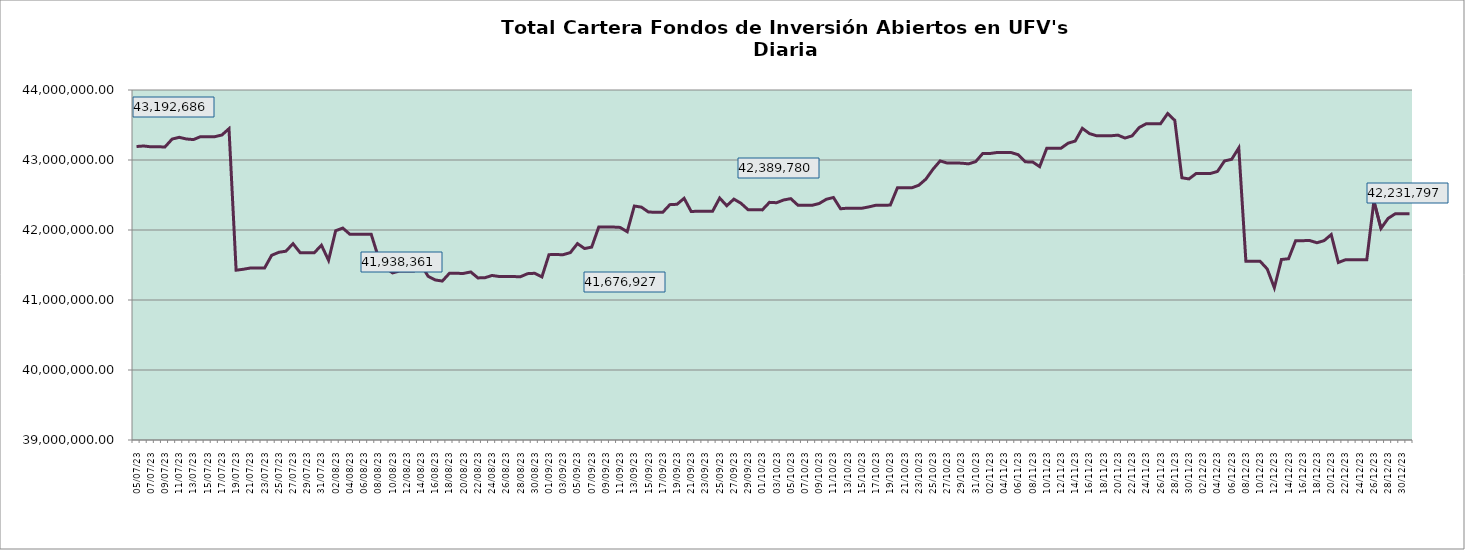
| Category | Cartera |
|---|---|
| 2023-07-05 | 43192686.34 |
| 2023-07-06 | 43200239.14 |
| 2023-07-07 | 43188626.88 |
| 2023-07-08 | 43187850.4 |
| 2023-07-09 | 43187104.54 |
| 2023-07-10 | 43298842.56 |
| 2023-07-11 | 43324023.73 |
| 2023-07-12 | 43300355.76 |
| 2023-07-13 | 43291538.65 |
| 2023-07-14 | 43333794.88 |
| 2023-07-15 | 43333475.93 |
| 2023-07-16 | 43333159.39 |
| 2023-07-17 | 43357047.45 |
| 2023-07-18 | 43447254.71 |
| 2023-07-19 | 41425630.36 |
| 2023-07-20 | 41438977.92 |
| 2023-07-21 | 41456769.13 |
| 2023-07-22 | 41456443.23 |
| 2023-07-23 | 41456161.03 |
| 2023-07-24 | 41638590.23 |
| 2023-07-25 | 41681225.4 |
| 2023-07-26 | 41697029.88 |
| 2023-07-27 | 41804683.04 |
| 2023-07-28 | 41676723.75 |
| 2023-07-29 | 41676408.14 |
| 2023-07-30 | 41676073.6 |
| 2023-07-31 | 41782568.47 |
| 2023-08-01 | 41567246.25 |
| 2023-08-02 | 41989389.58 |
| 2023-08-03 | 42027550.1 |
| 2023-08-04 | 41938597.62 |
| 2023-08-05 | 41938360.51 |
| 2023-08-06 | 41938153.1 |
| 2023-08-07 | 41937942.81 |
| 2023-08-08 | 41613622.08 |
| 2023-08-09 | 41463554.1 |
| 2023-08-10 | 41387337.54 |
| 2023-08-11 | 41414887.74 |
| 2023-08-12 | 41413764.61 |
| 2023-08-13 | 41413559.38 |
| 2023-08-14 | 41506858.89 |
| 2023-08-15 | 41338608.62 |
| 2023-08-16 | 41286301.63 |
| 2023-08-17 | 41270756.92 |
| 2023-08-18 | 41381603.16 |
| 2023-08-19 | 41380463.76 |
| 2023-08-20 | 41380147.98 |
| 2023-08-21 | 41400521 |
| 2023-08-22 | 41315409.32 |
| 2023-08-23 | 41318591.69 |
| 2023-08-24 | 41350548.96 |
| 2023-08-25 | 41335593.37 |
| 2023-08-26 | 41334963.42 |
| 2023-08-27 | 41334311.09 |
| 2023-08-28 | 41333141.15 |
| 2023-08-29 | 41376370.28 |
| 2023-08-30 | 41381821.03 |
| 2023-08-31 | 41329459.21 |
| 2023-09-01 | 41648116.09 |
| 2023-09-02 | 41648474.97 |
| 2023-09-03 | 41647849.67 |
| 2023-09-04 | 41676927.49 |
| 2023-09-05 | 41805487.28 |
| 2023-09-06 | 41735369.04 |
| 2023-09-07 | 41755206.18 |
| 2023-09-08 | 42043641.71 |
| 2023-09-09 | 42043028.37 |
| 2023-09-10 | 42042422.03 |
| 2023-09-11 | 42036906.74 |
| 2023-09-12 | 41975855.01 |
| 2023-09-13 | 42342509.7 |
| 2023-09-14 | 42326533.24 |
| 2023-09-15 | 42255754.6 |
| 2023-09-16 | 42254713.29 |
| 2023-09-17 | 42253678.62 |
| 2023-09-18 | 42362270.42 |
| 2023-09-19 | 42367252.26 |
| 2023-09-20 | 42452605.95 |
| 2023-09-21 | 42263697.89 |
| 2023-09-22 | 42269201.01 |
| 2023-09-23 | 42268191.65 |
| 2023-09-24 | 42267202 |
| 2023-09-25 | 42456350.25 |
| 2023-09-26 | 42346714.77 |
| 2023-09-27 | 42440978.47 |
| 2023-09-28 | 42381579.11 |
| 2023-09-29 | 42289102.56 |
| 2023-09-30 | 42288198.85 |
| 2023-10-01 | 42287410.93 |
| 2023-10-02 | 42395019.87 |
| 2023-10-03 | 42389780.2 |
| 2023-10-04 | 42428838.54 |
| 2023-10-05 | 42447910.21 |
| 2023-10-06 | 42354744.63 |
| 2023-10-07 | 42353951.46 |
| 2023-10-08 | 42353157.81 |
| 2023-10-09 | 42378630.44 |
| 2023-10-10 | 42438859.82 |
| 2023-10-11 | 42464556.73 |
| 2023-10-12 | 42303351.79 |
| 2023-10-13 | 42312277.18 |
| 2023-10-14 | 42311563.61 |
| 2023-10-15 | 42310863.49 |
| 2023-10-16 | 42330496.99 |
| 2023-10-17 | 42354399.37 |
| 2023-10-18 | 42352016.37 |
| 2023-10-19 | 42356548.36 |
| 2023-10-20 | 42603214.79 |
| 2023-10-21 | 42602528.51 |
| 2023-10-22 | 42601916.62 |
| 2023-10-23 | 42639157.05 |
| 2023-10-24 | 42726911.12 |
| 2023-10-25 | 42868514.71 |
| 2023-10-26 | 42986683.86 |
| 2023-10-27 | 42956471.69 |
| 2023-10-28 | 42955894.05 |
| 2023-10-29 | 42955238.7 |
| 2023-10-30 | 42944597.6 |
| 2023-10-31 | 42976802.28 |
| 2023-11-01 | 43093358.77 |
| 2023-11-02 | 43092484.46 |
| 2023-11-03 | 43107178.36 |
| 2023-11-04 | 43106690.27 |
| 2023-11-05 | 43106091.65 |
| 2023-11-06 | 43074970.72 |
| 2023-11-07 | 42973358.77 |
| 2023-11-08 | 42972674.39 |
| 2023-11-09 | 42905181.05 |
| 2023-11-10 | 43168443.62 |
| 2023-11-11 | 43168308.58 |
| 2023-11-12 | 43168113.82 |
| 2023-11-13 | 43240373.99 |
| 2023-11-14 | 43270689.6 |
| 2023-11-15 | 43452656.87 |
| 2023-11-16 | 43377305.54 |
| 2023-11-17 | 43346398.83 |
| 2023-11-18 | 43346275.14 |
| 2023-11-19 | 43345996.41 |
| 2023-11-20 | 43355290.36 |
| 2023-11-21 | 43313520.47 |
| 2023-11-22 | 43345046.77 |
| 2023-11-23 | 43463951.13 |
| 2023-11-24 | 43518849.38 |
| 2023-11-25 | 43518689.33 |
| 2023-11-26 | 43518613.5 |
| 2023-11-27 | 43663890.35 |
| 2023-11-28 | 43566224.18 |
| 2023-11-29 | 42746411.65 |
| 2023-11-30 | 42729756.9 |
| 2023-12-01 | 42807258.98 |
| 2023-12-02 | 42807197.19 |
| 2023-12-03 | 42807092.44 |
| 2023-12-04 | 42836421.66 |
| 2023-12-05 | 42986681.9 |
| 2023-12-06 | 43009721.06 |
| 2023-12-07 | 43172268.64 |
| 2023-12-08 | 41553464.95 |
| 2023-12-09 | 41553353.58 |
| 2023-12-10 | 41553233.21 |
| 2023-12-11 | 41443536.84 |
| 2023-12-12 | 41175240.65 |
| 2023-12-13 | 41578691.31 |
| 2023-12-14 | 41589415.94 |
| 2023-12-15 | 41848065.8 |
| 2023-12-16 | 41848147.79 |
| 2023-12-17 | 41848333.27 |
| 2023-12-18 | 41817881.84 |
| 2023-12-19 | 41848149.89 |
| 2023-12-20 | 41934834.15 |
| 2023-12-21 | 41535661.54 |
| 2023-12-22 | 41574569.14 |
| 2023-12-23 | 41574677.24 |
| 2023-12-24 | 41574915.52 |
| 2023-12-25 | 41575088.47 |
| 2023-12-26 | 42411895.63 |
| 2023-12-27 | 42022821.12 |
| 2023-12-28 | 42166018.8 |
| 2023-12-29 | 42231460.7 |
| 2023-12-30 | 42231676.24 |
| 2023-12-31 | 42231796.91 |